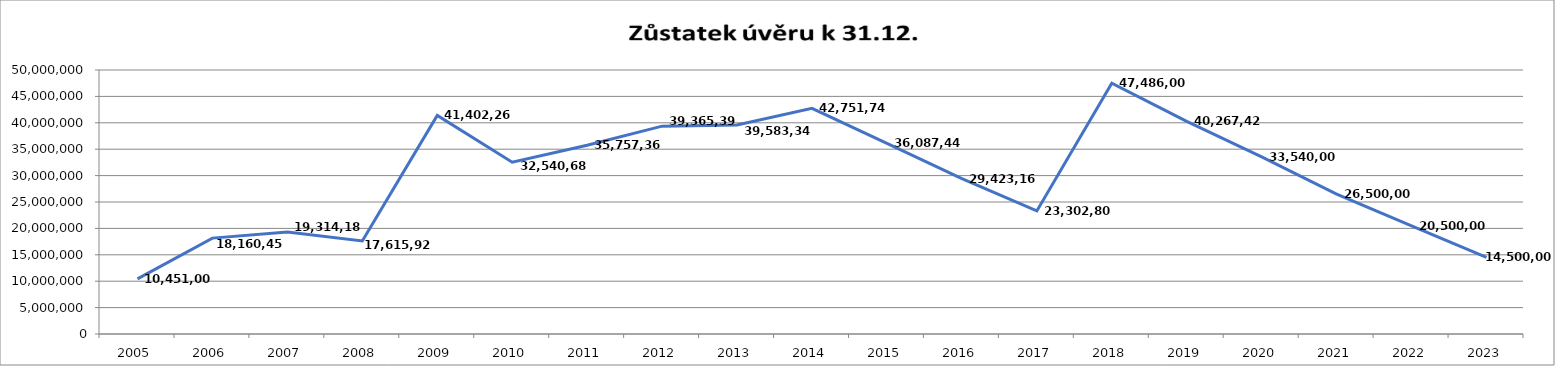
| Category | Series 0 |
|---|---|
| 2005.0 | 10451000 |
| 2006.0 | 18160456 |
| 2007.0 | 19314182 |
| 2008.0 | 17615925 |
| 2009.0 | 41402261 |
| 2010.0 | 32540684 |
| 2011.0 | 35757369 |
| 2012.0 | 39365393 |
| 2013.0 | 39583346 |
| 2014.0 | 42751745 |
| 2015.0 | 36087449 |
| 2016.0 | 29423165 |
| 2017.0 | 23302800 |
| 2018.0 | 47486005 |
| 2019.0 | 40267425 |
| 2020.0 | 33540000 |
| 2021.0 | 26500000 |
| 2022.0 | 20500000 |
| 2023.0 | 14500000 |